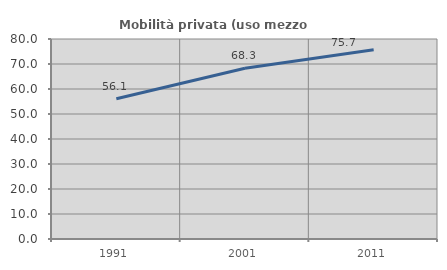
| Category | Mobilità privata (uso mezzo privato) |
|---|---|
| 1991.0 | 56.07 |
| 2001.0 | 68.276 |
| 2011.0 | 75.663 |